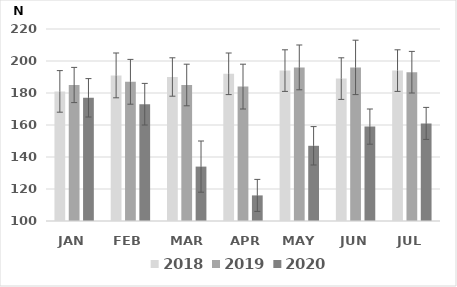
| Category | 2018 | 2019 | 2020 |
|---|---|---|---|
| JAN | 181 | 185 | 177 |
| FEB | 191 | 187 | 173 |
| MAR | 190 | 185 | 134 |
| APR | 192 | 184 | 116 |
| MAY | 194 | 196 | 147 |
| JUN | 189 | 196 | 159 |
| JUL | 194 | 193 | 161 |